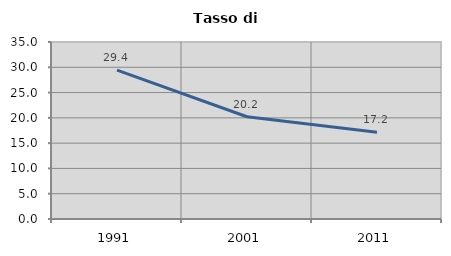
| Category | Tasso di disoccupazione   |
|---|---|
| 1991.0 | 29.434 |
| 2001.0 | 20.225 |
| 2011.0 | 17.163 |